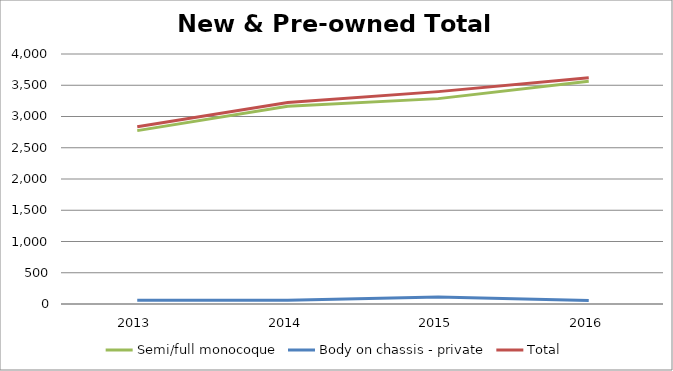
| Category | Semi/full monocoque | Body on chassis - private | Total |
|---|---|---|---|
| 2013.0 | 2774 | 62 | 2836 |
| 2014.0 | 3164 | 61 | 3225 |
| 2015.0 | 3286 | 112 | 3398 |
| 2016.0 | 3563 | 57 | 3620 |